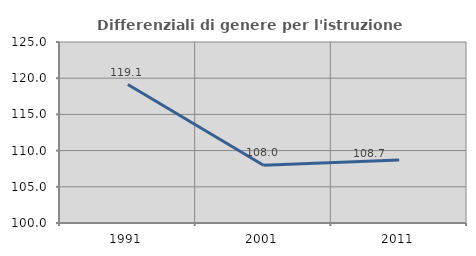
| Category | Differenziali di genere per l'istruzione superiore |
|---|---|
| 1991.0 | 119.122 |
| 2001.0 | 107.984 |
| 2011.0 | 108.688 |